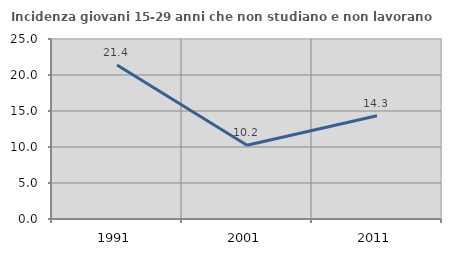
| Category | Incidenza giovani 15-29 anni che non studiano e non lavorano  |
|---|---|
| 1991.0 | 21.393 |
| 2001.0 | 10.247 |
| 2011.0 | 14.332 |